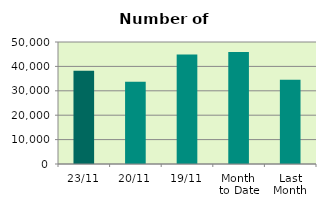
| Category | Series 0 |
|---|---|
| 23/11 | 38268 |
| 20/11 | 33694 |
| 19/11 | 44854 |
| Month 
to Date | 45914.5 |
| Last
Month | 34490.636 |